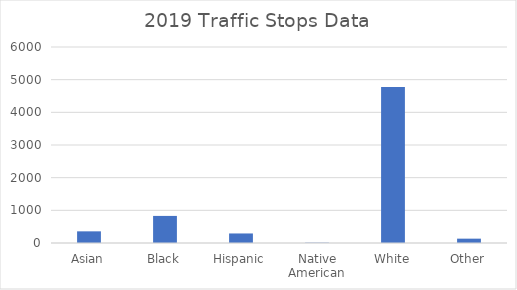
| Category | Series 0 |
|---|---|
| Asian | 357 |
| Black | 829 |
| Hispanic | 292 |
| Native American | 9 |
| White | 4779 |
| Other | 133 |